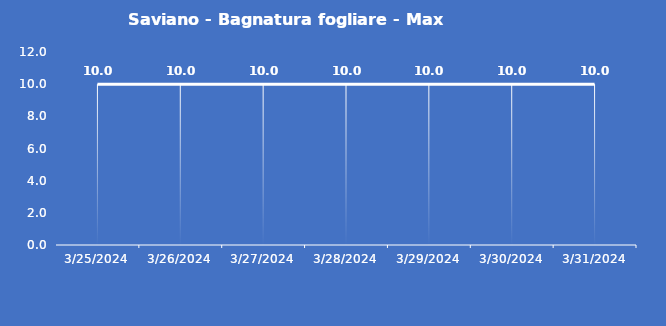
| Category | Saviano - Bagnatura fogliare - Max (min) |
|---|---|
| 3/25/24 | 10 |
| 3/26/24 | 10 |
| 3/27/24 | 10 |
| 3/28/24 | 10 |
| 3/29/24 | 10 |
| 3/30/24 | 10 |
| 3/31/24 | 10 |